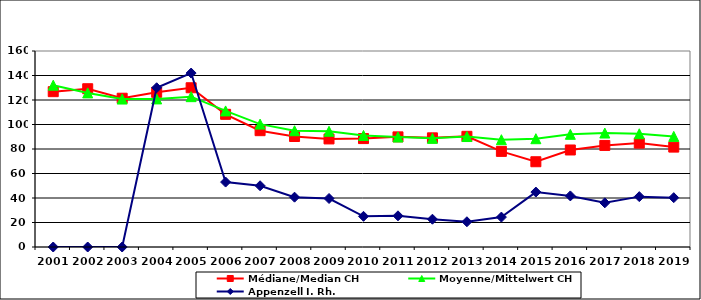
| Category | Médiane/Median CH | Moyenne/Mittelwert CH | Appenzell I. Rh. |
|---|---|---|---|
| 2001.0 | 126.8 | 132.1 | 0 |
| 2002.0 | 129.2 | 125.8 | 0 |
| 2003.0 | 121.45 | 120.775 | 0 |
| 2004.0 | 126.25 | 120.889 | 130 |
| 2005.0 | 130 | 122.728 | 142 |
| 2006.0 | 108.3 | 111.087 | 53 |
| 2007.0 | 94.96 | 100.307 | 50 |
| 2008.0 | 90.2 | 94.911 | 40.67 |
| 2009.0 | 88.22 | 94.453 | 39.6 |
| 2010.0 | 88.5 | 91.058 | 25.05 |
| 2011.0 | 89.9 | 89.805 | 25.45 |
| 2012.0 | 89.11 | 88.689 | 22.68 |
| 2013.0 | 90.35 | 90.167 | 20.6 |
| 2014.0 | 78.06 | 87.587 | 24.41 |
| 2015.0 | 69.6 | 88.398 | 44.84 |
| 2016.0 | 79.2 | 91.977 | 41.7 |
| 2017.0 | 82.9 | 93.027 | 36.06 |
| 2018.0 | 84.8 | 92.448 | 41.11 |
| 2019.0 | 81.555 | 90.304 | 40.27 |